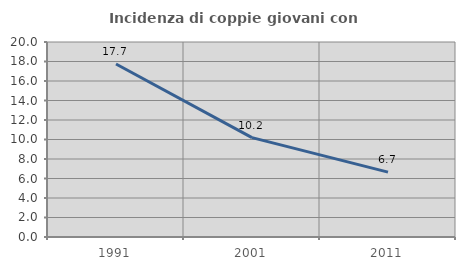
| Category | Incidenza di coppie giovani con figli |
|---|---|
| 1991.0 | 17.746 |
| 2001.0 | 10.189 |
| 2011.0 | 6.651 |